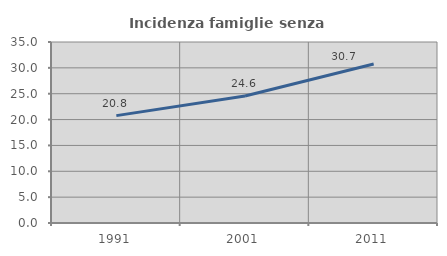
| Category | Incidenza famiglie senza nuclei |
|---|---|
| 1991.0 | 20.765 |
| 2001.0 | 24.561 |
| 2011.0 | 30.748 |